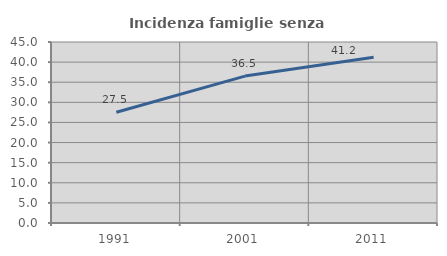
| Category | Incidenza famiglie senza nuclei |
|---|---|
| 1991.0 | 27.532 |
| 2001.0 | 36.527 |
| 2011.0 | 41.22 |